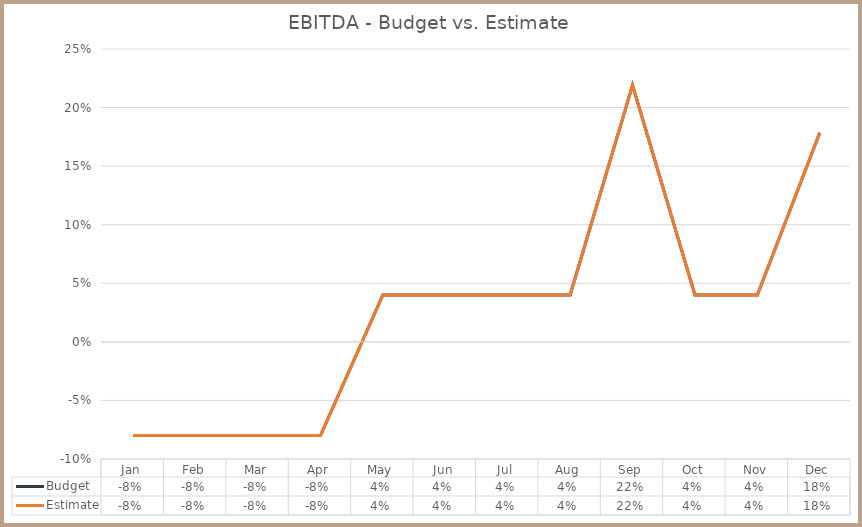
| Category | Budget | Estimate |
|---|---|---|
| Jan | -0.08 | -0.08 |
| Feb | -0.08 | -0.08 |
| Mar | -0.08 | -0.08 |
| Apr | -0.08 | -0.08 |
| May | 0.04 | 0.04 |
| Jun | 0.04 | 0.04 |
| Jul | 0.04 | 0.04 |
| Aug | 0.04 | 0.04 |
| Sep | 0.219 | 0.219 |
| Oct | 0.04 | 0.04 |
| Nov | 0.04 | 0.04 |
| Dec | 0.178 | 0.178 |